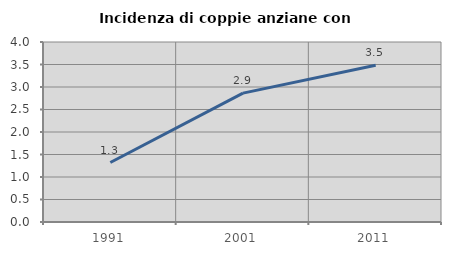
| Category | Incidenza di coppie anziane con figli |
|---|---|
| 1991.0 | 1.322 |
| 2001.0 | 2.865 |
| 2011.0 | 3.484 |